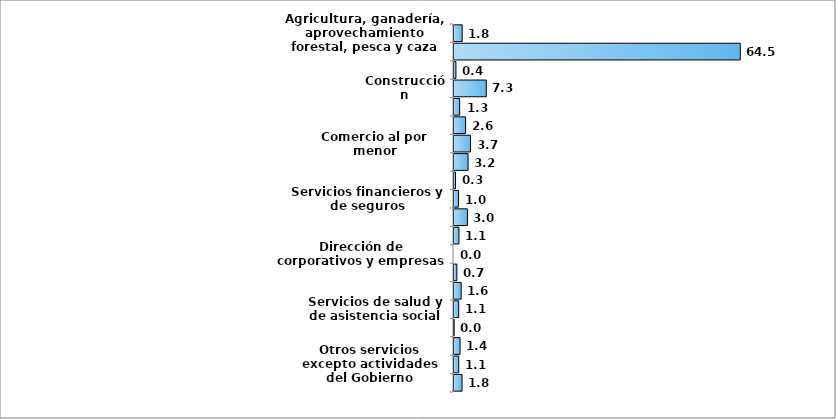
| Category | Campeche |
|---|---|
| Agricultura, ganadería, aprovechamiento forestal, pesca y caza | 1.844 |
| Minería | 64.517 |
| Electricidad, agua y suministro de gas por ductos al consumidor final | 0.437 |
| Construcción | 7.287 |
| Industrias manufactureras | 1.284 |
| Comercio al por mayor | 2.613 |
| Comercio al por menor | 3.729 |
| Transportes, correos y almacenamiento | 3.171 |
| Información en medios masivos | 0.345 |
| Servicios financieros y de seguros | 1.022 |
| Servicios inmobiliarios y de alquiler de bienes muebles e intangibles | 3.026 |
| Servicios profesionales, científicos y técnicos | 1.108 |
| Dirección de corporativos y empresas | 0 |
| Servicios de apoyo a los negocios y manejo de desechos y servicios de remediación | 0.653 |
| Servicios educativos | 1.616 |
| Servicios de salud y de asistencia social | 1.058 |
| Servicios de esparcimiento culturales y deportivos, y otros servicios recreativos | 0.035 |
| Servicios de alojamiento temporal y de preparación de alimentos y bebidas | 1.368 |
| Otros servicios excepto actividades del Gobierno | 1.067 |
| Actividades del Gobierno | 1.816 |